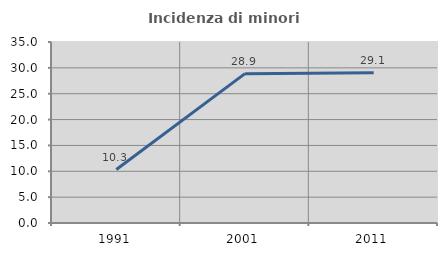
| Category | Incidenza di minori stranieri |
|---|---|
| 1991.0 | 10.345 |
| 2001.0 | 28.881 |
| 2011.0 | 29.07 |